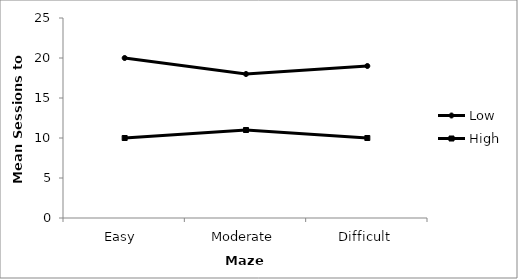
| Category | Low | High |
|---|---|---|
| Easy  | 20 | 10 |
| Moderate | 18 | 11 |
| Difficult | 19 | 10 |